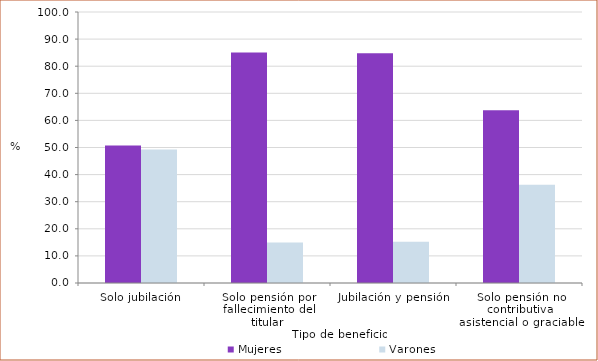
| Category | Mujeres | Varones |
|---|---|---|
| Solo jubilación | 50.733 | 49.267 |
| Solo pensión por fallecimiento del titular | 85.035 | 14.965 |
| Jubilación y pensión | 84.736 | 15.264 |
| Solo pensión no contributiva asistencial o graciable | 63.771 | 36.229 |